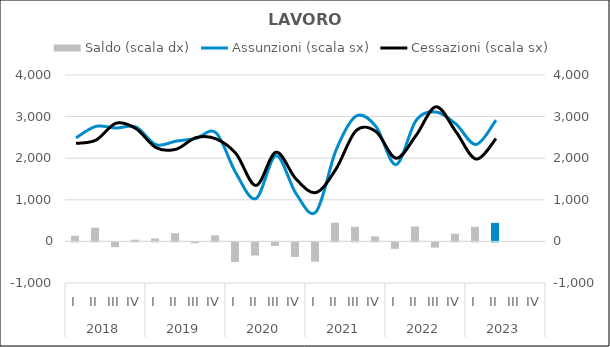
| Category | Saldo (scala dx) |
|---|---|
| 0 | 135 |
| 1 | 330 |
| 2 | -115 |
| 3 | 40 |
| 4 | 70 |
| 5 | 195 |
| 6 | -20 |
| 7 | 145 |
| 8 | -470 |
| 9 | -315 |
| 10 | -85 |
| 11 | -350 |
| 12 | -465 |
| 13 | 450 |
| 14 | 350 |
| 15 | 120 |
| 16 | -155 |
| 17 | 360 |
| 18 | -125 |
| 19 | 185 |
| 20 | 350 |
| 21 | 445 |
| 22 | 0 |
| 23 | 0 |